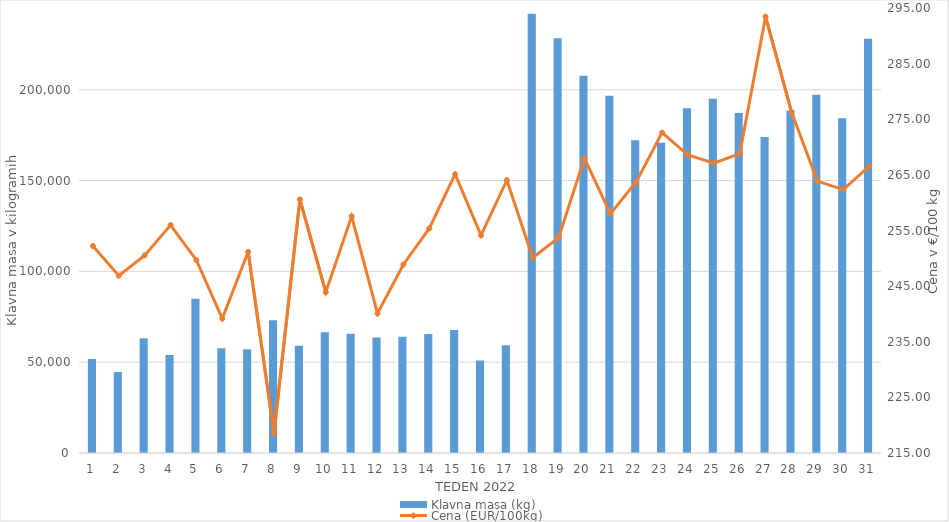
| Category | Klavna masa (kg) |
|---|---|
| 1.0 | 51818 |
| 2.0 | 44619 |
| 3.0 | 63233 |
| 4.0 | 53993 |
| 5.0 | 84871 |
| 6.0 | 57648 |
| 7.0 | 57159 |
| 8.0 | 73139 |
| 9.0 | 59056 |
| 10.0 | 66417 |
| 11.0 | 65723 |
| 12.0 | 63530 |
| 13.0 | 64069 |
| 14.0 | 65564 |
| 15.0 | 67787 |
| 16.0 | 50958 |
| 17.0 | 59387 |
| 18.0 | 241833 |
| 19.0 | 228389 |
| 20.0 | 207661 |
| 21.0 | 196732 |
| 22.0 | 172190 |
| 23.0 | 170751 |
| 24.0 | 189775 |
| 25.0 | 195029 |
| 26.0 | 187239 |
| 27.0 | 173967 |
| 28.0 | 188601 |
| 29.0 | 197293 |
| 30.0 | 184259 |
| 31.0 | 228023 |